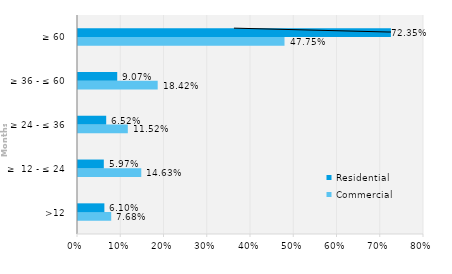
| Category | Commercial | Residential |
|---|---|---|
| >12 | 0.077 | 0.061 |
| ≥  12 - ≤ 24 | 0.146 | 0.06 |
| ≥ 24 - ≤ 36 | 0.115 | 0.065 |
| ≥ 36 - ≤ 60 | 0.184 | 0.091 |
| ≥ 60 | 0.477 | 0.723 |